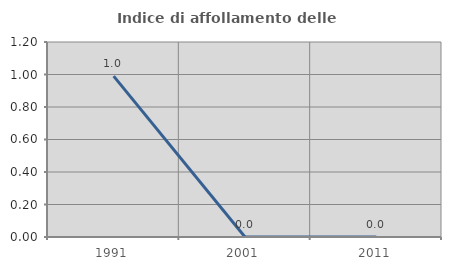
| Category | Indice di affollamento delle abitazioni  |
|---|---|
| 1991.0 | 0.99 |
| 2001.0 | 0 |
| 2011.0 | 0 |